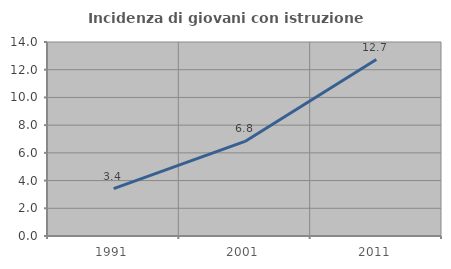
| Category | Incidenza di giovani con istruzione universitaria |
|---|---|
| 1991.0 | 3.425 |
| 2001.0 | 6.823 |
| 2011.0 | 12.731 |